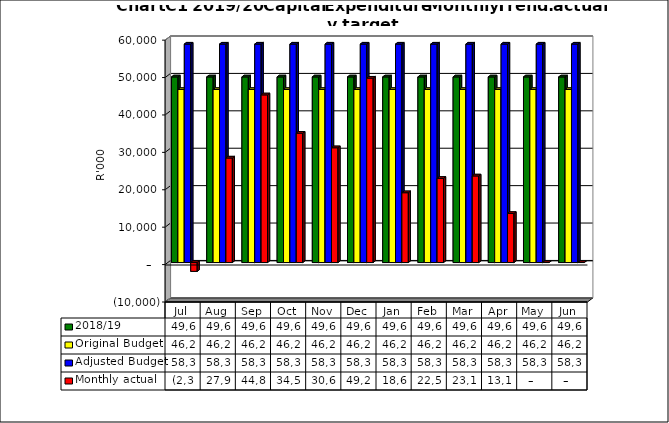
| Category | 2018/19 | Original Budget | Adjusted Budget | Monthly actual |
|---|---|---|---|---|
| Jul | 49622169.308 | 46259409.917 | 58394184.533 | -2354849.52 |
| Aug | 49622169.308 | 46259409.917 | 58394184.533 | 27946048.88 |
| Sep | 49622169.308 | 46259409.917 | 58394184.533 | 44817031.05 |
| Oct | 49622169.308 | 46259409.917 | 58394184.533 | 34585671.62 |
| Nov | 49622169.308 | 46259409.917 | 58394184.533 | 30684238.44 |
| Dec | 49622169.308 | 46259409.917 | 58394184.533 | 49297719.75 |
| Jan | 49622169.308 | 46259409.917 | 58394184.533 | 18669297.1 |
| Feb | 49622169.308 | 46259409.917 | 58394184.533 | 22500413.45 |
| Mar | 49622169.308 | 46259409.917 | 58394184.533 | 23150031.02 |
| Apr | 49622169.308 | 46259409.917 | 58394184.533 | 13115388.32 |
| May | 49622169.308 | 46259409.917 | 58394184.533 | 0 |
| Jun | 49622169.308 | 46259409.917 | 58394184.533 | 0 |